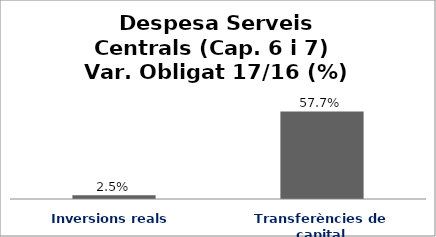
| Category | Series 0 |
|---|---|
| Inversions reals | 0.025 |
| Transferències de capital | 0.577 |